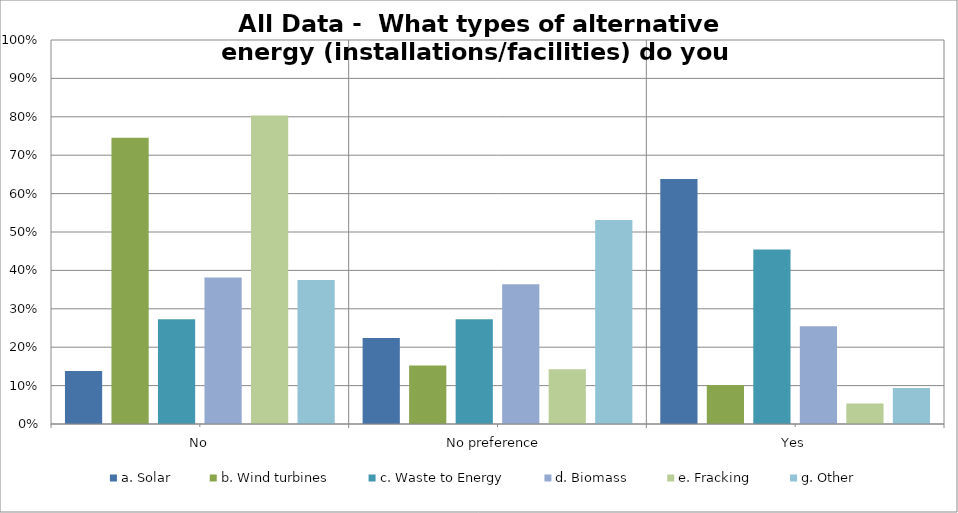
| Category | a. Solar | b. Wind turbines | c. Waste to Energy | d. Biomass | e. Fracking | g. Other |
|---|---|---|---|---|---|---|
| No | 0.138 | 0.746 | 0.273 | 0.382 | 0.804 | 0.375 |
| No preference  | 0.224 | 0.153 | 0.273 | 0.364 | 0.143 | 0.531 |
| Yes | 0.638 | 0.102 | 0.455 | 0.255 | 0.054 | 0.094 |